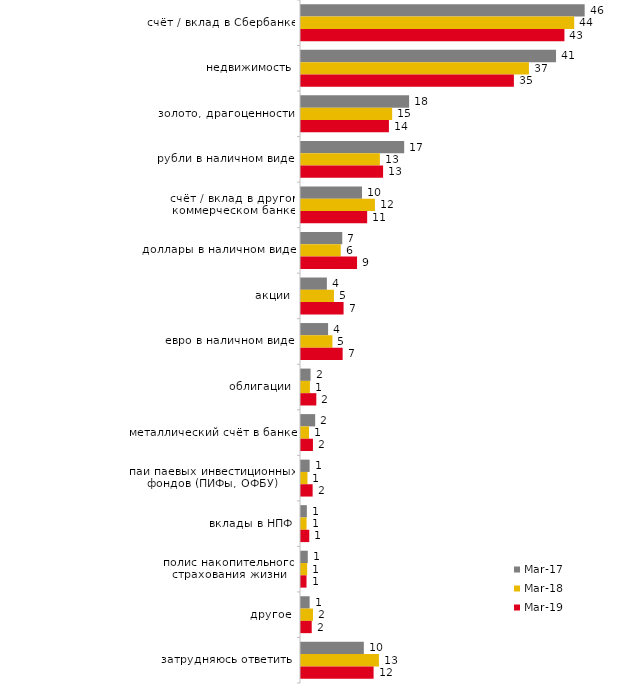
| Category | мар.17 | мар.18 | мар.19 |
|---|---|---|---|
| счёт / вклад в Сбербанке | 46.05 | 44.35 | 42.765 |
| недвижимость | 41.4 | 37 | 34.56 |
| золото, драгоценности | 17.55 | 14.8 | 14.272 |
| рубли в наличном виде | 16.75 | 12.8 | 13.327 |
| счёт / вклад в другом коммерческом банке | 9.9 | 12 | 10.741 |
| доллары в наличном виде | 6.7 | 6.45 | 9.1 |
| акции | 4.2 | 5.35 | 6.912 |
| евро в наличном виде | 4.4 | 5.1 | 6.763 |
| облигации | 1.55 | 1.45 | 2.486 |
| металлический счёт в банке | 2.3 | 1.3 | 1.939 |
| паи паевых инвестиционных фондов (ПИФы, ОФБУ) | 1.4 | 1.05 | 1.89 |
| вклады в НПФ | 0.95 | 0.9 | 1.343 |
| полис накопительного страхования жизни | 1.1 | 1 | 0.895 |
| другое | 1.4 | 1.95 | 1.74 |
| затрудняюсь ответить | 10.2 | 12.65 | 11.785 |